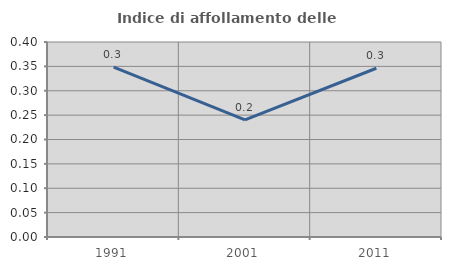
| Category | Indice di affollamento delle abitazioni  |
|---|---|
| 1991.0 | 0.348 |
| 2001.0 | 0.24 |
| 2011.0 | 0.346 |